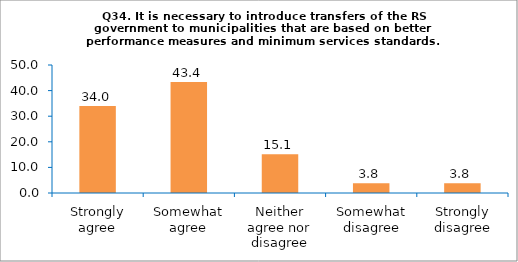
| Category | Series 0 |
|---|---|
| Strongly agree | 33.962 |
| Somewhat agree | 43.396 |
| Neither agree nor disagree | 15.094 |
| Somewhat disagree | 3.774 |
| Strongly disagree | 3.774 |